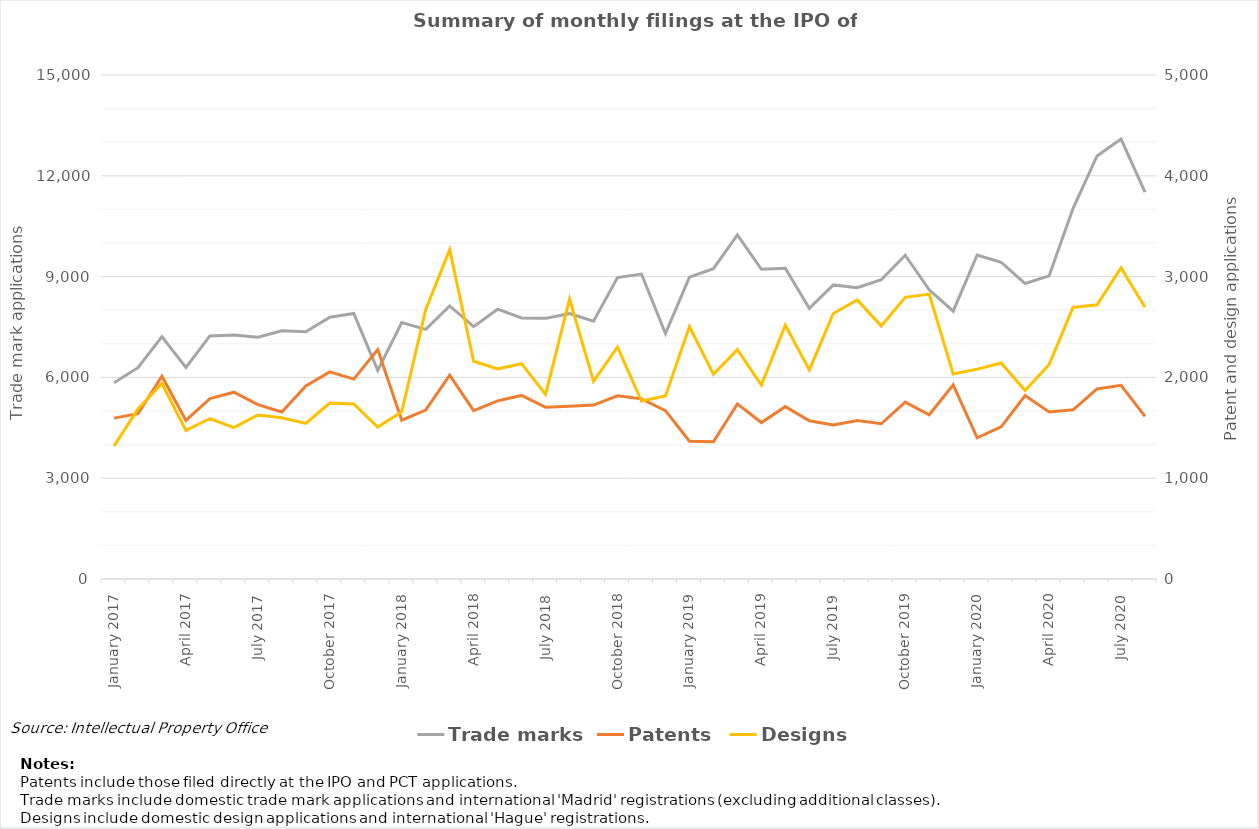
| Category | Trade marks |
|---|---|
| January 2017 | 5843 |
| February 2017 | 6288 |
| March 2017 | 7214 |
| April 2017 | 6297 |
| May 2017 | 7234 |
| June 2017 | 7263 |
| July 2017 | 7197 |
| August 2017 | 7389 |
| September 2017 | 7359 |
| October 2017 | 7792 |
| November 2017 | 7901 |
| December 2017 | 6211 |
| January 2018 | 7634 |
| February 2018 | 7428 |
| March 2018 | 8127 |
| April 2018 | 7512 |
| May 2018 | 8030 |
| June 2018 | 7769 |
| July 2018 | 7757 |
| August 2018 | 7897 |
| September 2018 | 7673 |
| October 2018 | 8972 |
| November 2018 | 9076 |
| December 2018 | 7304 |
| January 2019 | 8983 |
| February 2019 | 9234 |
| March 2019 | 10244 |
| April 2019 | 9219 |
| May 2019 | 9251 |
| June 2019 | 8053 |
| July 2019 | 8752 |
| August 2019 | 8670 |
| September 2019 | 8907 |
| October 2019 | 9636 |
| November 2019 | 8607 |
| December 2019 | 7970 |
| January 2020 | 9642 |
| February 2020 | 9428 |
| March 2020 | 8794 |
| April 2020 | 9021 |
| May 2020 | 11034 |
| June 2020 | 12590 |
| July 2020 | 13092 |
| August 2020 | 11515 |